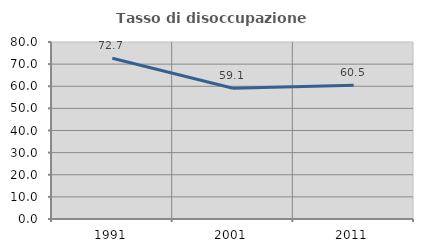
| Category | Tasso di disoccupazione giovanile  |
|---|---|
| 1991.0 | 72.68 |
| 2001.0 | 59.091 |
| 2011.0 | 60.49 |